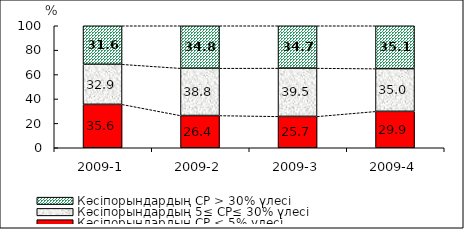
| Category | Кәсіпорындардың СР < 5% үлесі | Кәсіпорындардың 5≤ СР≤ 30% үлесі | Кәсіпорындардың СР > 30% үлесі |
|---|---|---|---|
| 2009-1 | 35.582 | 32.862 | 31.556 |
| 2009-2 | 26.434 | 38.769 | 34.797 |
| 2009-3 | 25.743 | 39.532 | 34.725 |
| 2009-4 | 29.854 | 35.017 | 35.129 |